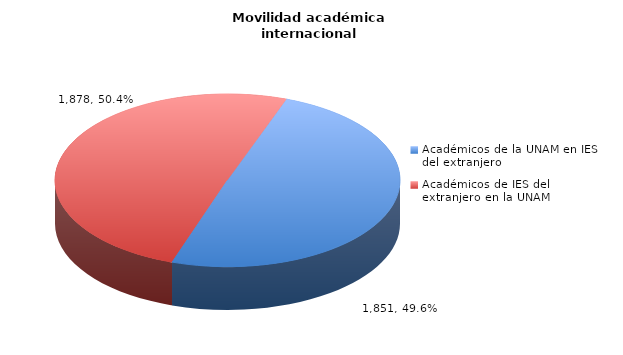
| Category | Series 0 |
|---|---|
| Académicos de la UNAM en IES del extranjero | 1851 |
| Académicos de IES del extranjero en la UNAM | 1878 |